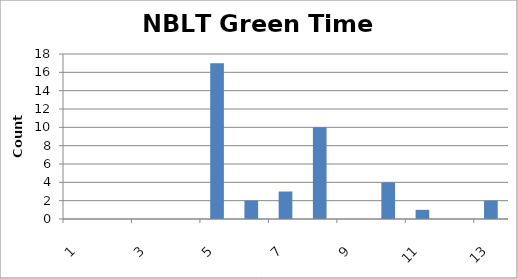
| Category | Series 0 |
|---|---|
| 0 | 0 |
| 1 | 0 |
| 2 | 0 |
| 3 | 0 |
| 4 | 17 |
| 5 | 2 |
| 6 | 3 |
| 7 | 10 |
| 8 | 0 |
| 9 | 4 |
| 10 | 1 |
| 11 | 0 |
| 12 | 2 |